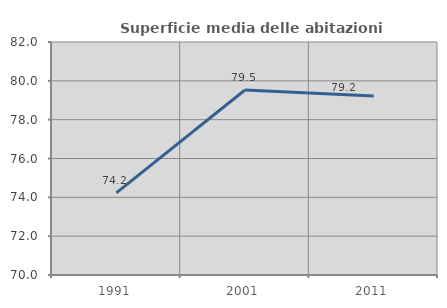
| Category | Superficie media delle abitazioni occupate |
|---|---|
| 1991.0 | 74.233 |
| 2001.0 | 79.529 |
| 2011.0 | 79.224 |